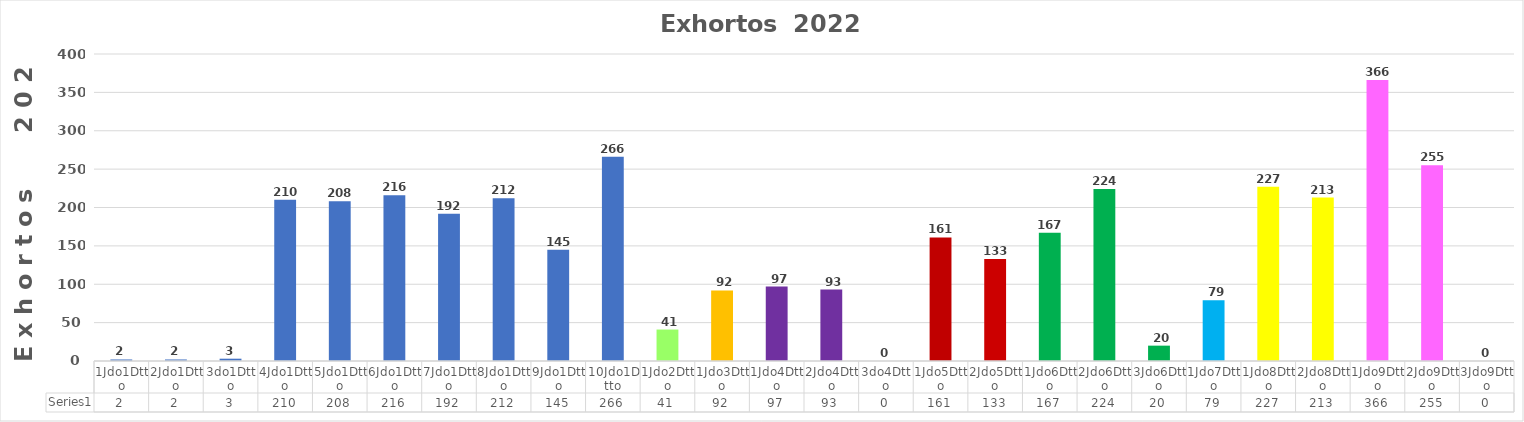
| Category | Series 0 |
|---|---|
| 1Jdo1Dtto | 2 |
| 2Jdo1Dtto | 2 |
| 3do1Dtto | 3 |
| 4Jdo1Dtto | 210 |
| 5Jdo1Dtto | 208 |
| 6Jdo1Dtto | 216 |
| 7Jdo1Dtto | 192 |
| 8Jdo1Dtto | 212 |
| 9Jdo1Dtto | 145 |
| 10Jdo1Dtto | 266 |
| 1Jdo2Dtto | 41 |
| 1Jdo3Dtto | 92 |
| 1Jdo4Dtto | 97 |
| 2Jdo4Dtto | 93 |
| 3do4Dtto | 0 |
| 1Jdo5Dtto | 161 |
| 2Jdo5Dtto | 133 |
| 1Jdo6Dtto | 167 |
| 2Jdo6Dtto | 224 |
| 3Jdo6Dtto | 20 |
| 1Jdo7Dtto | 79 |
| 1Jdo8Dtto | 227 |
| 2Jdo8Dtto | 213 |
| 1Jdo9Dtto | 366 |
| 2Jdo9Dtto | 255 |
| 3Jdo9Dtto | 0 |